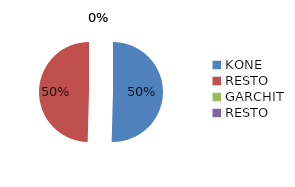
| Category | Series 0 |
|---|---|
| KONE | 0.289 |
| RESTO | 0.284 |
| GARCHIT | 0 |
| RESTO | 0 |